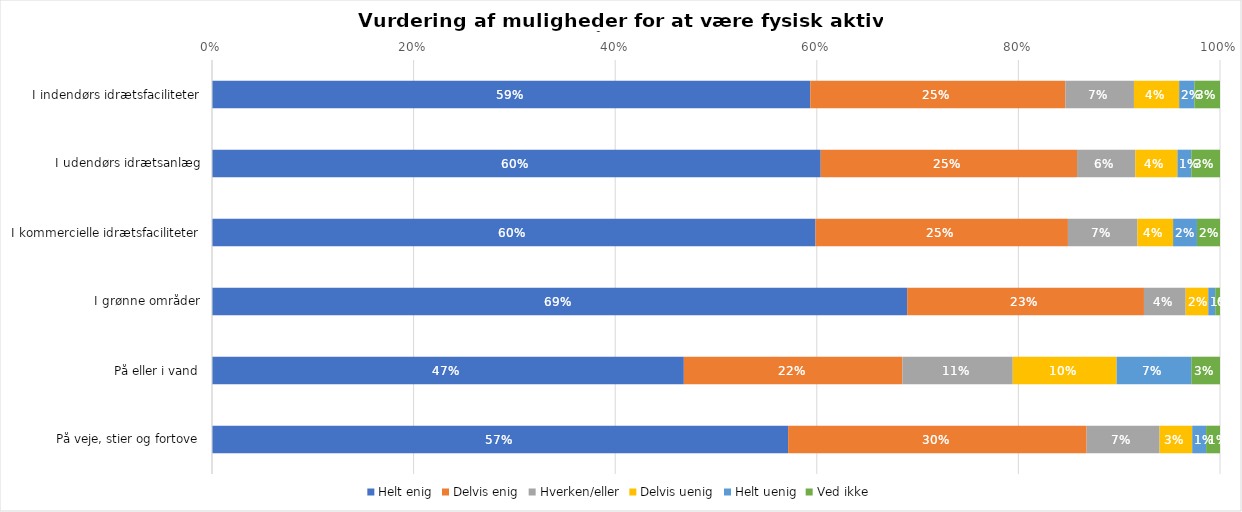
| Category | Helt enig | Delvis enig | Hverken/eller | Delvis uenig | Helt uenig | Ved ikke |
|---|---|---|---|---|---|---|
| I indendørs idrætsfaciliteter | 0.594 | 0.253 | 0.068 | 0.045 | 0.015 | 0.025 |
| I udendørs idrætsanlæg | 0.604 | 0.254 | 0.058 | 0.042 | 0.014 | 0.028 |
| I kommercielle idrætsfaciliteter | 0.599 | 0.25 | 0.069 | 0.035 | 0.024 | 0.023 |
| I grønne områder | 0.69 | 0.235 | 0.041 | 0.022 | 0.007 | 0.005 |
| På eller i vand | 0.468 | 0.217 | 0.109 | 0.103 | 0.074 | 0.028 |
| På veje, stier og fortove | 0.572 | 0.296 | 0.072 | 0.032 | 0.014 | 0.014 |